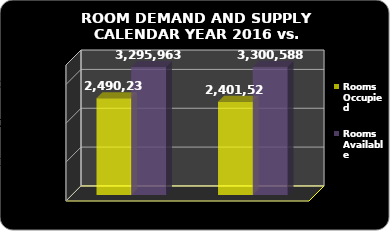
| Category | Rooms Occupied | Rooms Available |
|---|---|---|
| 2016.0 | 2401522 | 3300588 |
| 2015.0 | 2490235 | 3295963 |